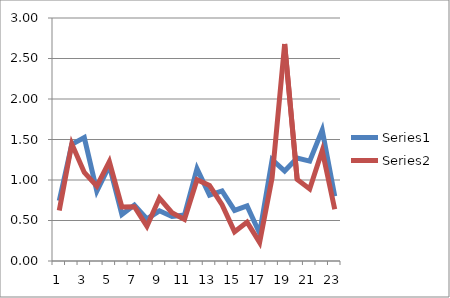
| Category | Series 0 | Series 1 |
|---|---|---|
| 0 | 0.743 | 0.623 |
| 1 | 1.44 | 1.447 |
| 2 | 1.523 | 1.093 |
| 3 | 0.863 | 0.923 |
| 4 | 1.177 | 1.227 |
| 5 | 0.573 | 0.667 |
| 6 | 0.69 | 0.67 |
| 7 | 0.52 | 0.43 |
| 8 | 0.62 | 0.777 |
| 9 | 0.55 | 0.597 |
| 10 | 0.567 | 0.513 |
| 11 | 1.14 | 1.003 |
| 12 | 0.813 | 0.933 |
| 13 | 0.865 | 0.695 |
| 14 | 0.625 | 0.36 |
| 15 | 0.68 | 0.48 |
| 16 | 0.343 | 0.23 |
| 17 | 1.25 | 1.03 |
| 18 | 1.11 | 2.68 |
| 19 | 1.27 | 1.007 |
| 20 | 1.233 | 0.89 |
| 21 | 1.615 | 1.363 |
| 22 | 0.8 | 0.64 |